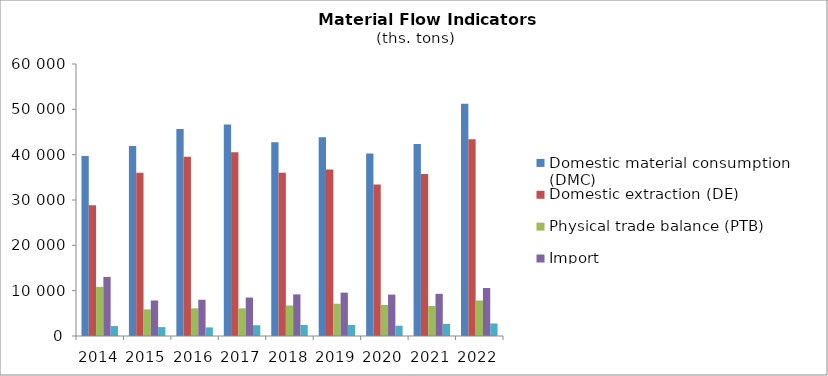
| Category | Domestic material consumption (DMC) | Domestic extraction (DE) | Physical trade balance (PTB) | Import | Export |
|---|---|---|---|---|---|
| 2014.0 | 39701 | 28867 | 10834 | 13027 | 2193 |
| 2015.0 | 41885 | 36010 | 5875 | 7833 | 1959 |
| 2016.0 | 45660 | 39554 | 6106 | 7998 | 1893 |
| 2017.0 | 46645 | 40540 | 6104 | 8483 | 2379 |
| 2018.0 | 42754 | 36023 | 6731 | 9178 | 2447 |
| 2019.0 | 43836 | 36716 | 7119 | 9566 | 2447 |
| 2020.0 | 40264 | 33402 | 6863 | 9127 | 2265 |
| 2021.0 | 42339 | 35714 | 6625 | 9295 | 2669 |
| 2022.0 | 51256 | 43421 | 7835 | 10593 | 2758 |